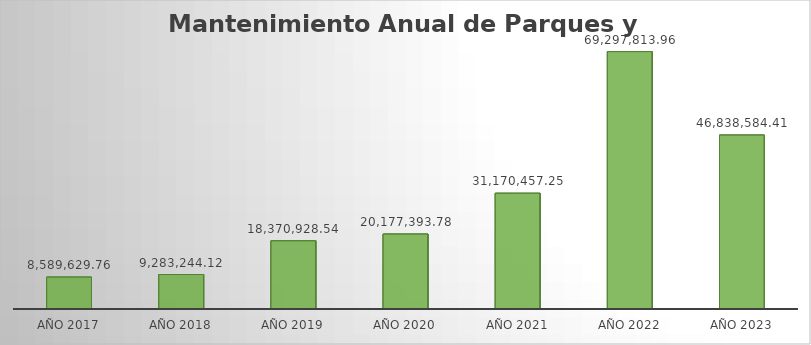
| Category | Suma |
|---|---|
| AÑO 2017 | 8589629.76 |
| AÑO 2018 | 9283244.12 |
| AÑO 2019 | 18370928.54 |
| AÑO 2020 | 20177393.78 |
| AÑO 2021 | 31170457.25 |
| AÑO 2022 | 69297813.96 |
| AÑO 2023 | 46838584.41 |